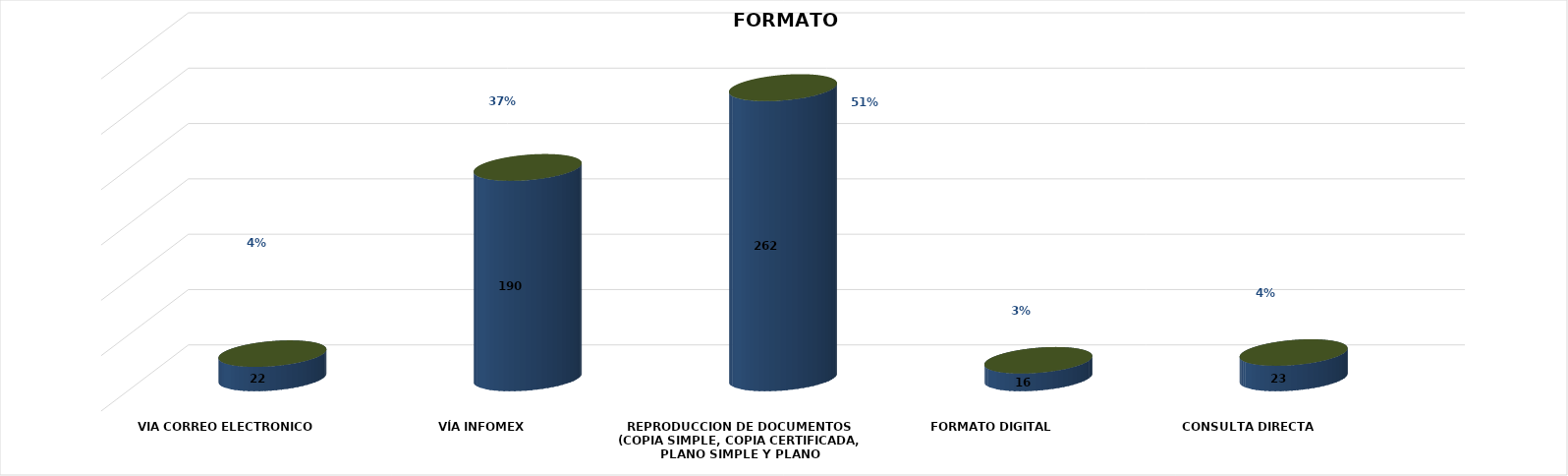
| Category | Series 0 | Series 1 | Series 2 | Series 3 | Series 4 |
|---|---|---|---|---|---|
| VIA CORREO ELECTRONICO |  |  |  | 22 | 0.043 |
| VÍA INFOMEX |  |  |  | 190 | 0.37 |
| REPRODUCCION DE DOCUMENTOS (COPIA SIMPLE, COPIA CERTIFICADA, PLANO SIMPLE Y PLANO CERTIFICADO) |  |  |  | 262 | 0.511 |
| FORMATO DIGITAL |  |  |  | 16 | 0.031 |
| CONSULTA DIRECTA |  |  |  | 23 | 0.045 |